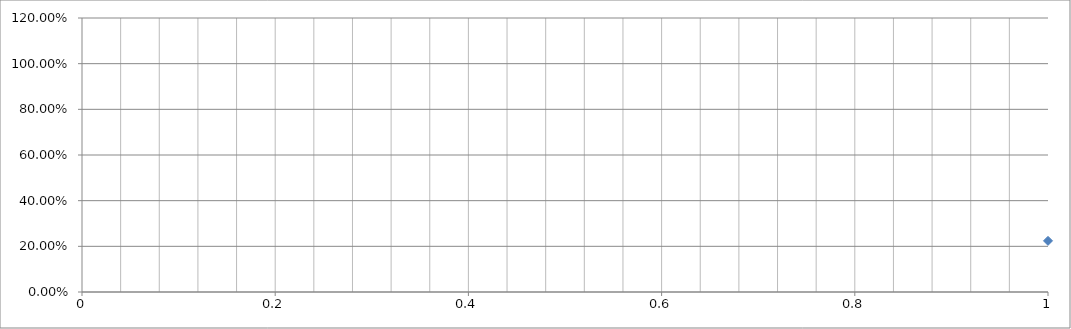
| Category | Series 0 |
|---|---|
| 0 | 0.224 |
| 1 | 0.387 |
| 2 | 0.491 |
| 3 | 0.574 |
| 4 | 0.628 |
| 5 | 0.656 |
| 6 | 0.682 |
| 7 | 0.707 |
| 8 | 0.725 |
| 9 | 0.743 |
| 10 | 0.76 |
| 11 | 0.774 |
| 12 | 0.788 |
| 13 | 0.798 |
| 14 | 0.807 |
| 15 | 0.817 |
| 16 | 0.825 |
| 17 | 0.833 |
| 18 | 0.841 |
| 19 | 0.849 |
| 20 | 0.856 |
| 21 | 0.863 |
| 22 | 0.869 |
| 23 | 0.876 |
| 24 | 0.882 |
| 25 | 0.888 |
| 26 | 0.893 |
| 27 | 0.899 |
| 28 | 0.905 |
| 29 | 0.91 |
| 30 | 0.915 |
| 31 | 0.921 |
| 32 | 0.926 |
| 33 | 0.93 |
| 34 | 0.933 |
| 35 | 0.937 |
| 36 | 0.941 |
| 37 | 0.944 |
| 38 | 0.947 |
| 39 | 0.95 |
| 40 | 0.953 |
| 41 | 0.956 |
| 42 | 0.958 |
| 43 | 0.961 |
| 44 | 0.963 |
| 45 | 0.965 |
| 46 | 0.967 |
| 47 | 0.969 |
| 48 | 0.971 |
| 49 | 0.972 |
| 50 | 0.974 |
| 51 | 0.976 |
| 52 | 0.977 |
| 53 | 0.979 |
| 54 | 0.98 |
| 55 | 0.981 |
| 56 | 0.982 |
| 57 | 0.984 |
| 58 | 0.985 |
| 59 | 0.986 |
| 60 | 0.987 |
| 61 | 0.988 |
| 62 | 0.989 |
| 63 | 0.99 |
| 64 | 0.99 |
| 65 | 0.991 |
| 66 | 0.992 |
| 67 | 0.993 |
| 68 | 0.994 |
| 69 | 0.994 |
| 70 | 0.995 |
| 71 | 0.996 |
| 72 | 0.996 |
| 73 | 0.997 |
| 74 | 0.997 |
| 75 | 0.997 |
| 76 | 0.998 |
| 77 | 0.998 |
| 78 | 0.999 |
| 79 | 0.999 |
| 80 | 0.999 |
| 81 | 0.999 |
| 82 | 0.999 |
| 83 | 1 |
| 84 | 1 |
| 85 | 1 |
| 86 | 1 |
| 87 | 1 |
| 88 | 1 |